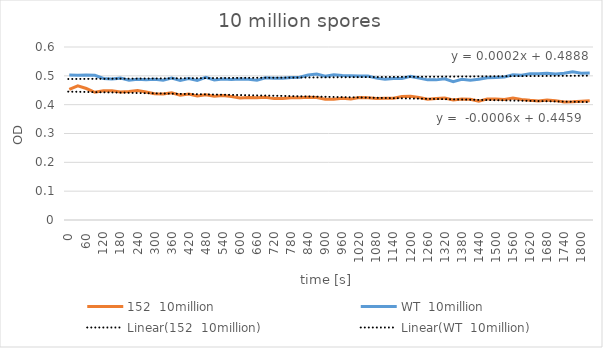
| Category | 152  10million | WT  10million |
|---|---|---|
| 0.0 | 0.453 | 0.503 |
| 30.0 | 0.465 | 0.502 |
| 60.0 | 0.456 | 0.503 |
| 90.0 | 0.443 | 0.502 |
| 120.0 | 0.448 | 0.491 |
| 150.0 | 0.448 | 0.489 |
| 180.0 | 0.444 | 0.492 |
| 210.0 | 0.446 | 0.485 |
| 240.0 | 0.449 | 0.488 |
| 270.0 | 0.444 | 0.486 |
| 300.0 | 0.438 | 0.488 |
| 330.0 | 0.437 | 0.485 |
| 360.0 | 0.441 | 0.492 |
| 390.0 | 0.433 | 0.484 |
| 420.0 | 0.437 | 0.491 |
| 450.0 | 0.43 | 0.484 |
| 480.0 | 0.434 | 0.495 |
| 510.0 | 0.429 | 0.486 |
| 540.0 | 0.432 | 0.489 |
| 570.0 | 0.428 | 0.487 |
| 600.0 | 0.423 | 0.489 |
| 630.0 | 0.425 | 0.488 |
| 660.0 | 0.424 | 0.485 |
| 690.0 | 0.426 | 0.493 |
| 720.0 | 0.421 | 0.492 |
| 750.0 | 0.421 | 0.492 |
| 780.0 | 0.424 | 0.494 |
| 810.0 | 0.424 | 0.495 |
| 840.0 | 0.426 | 0.503 |
| 870.0 | 0.425 | 0.506 |
| 900.0 | 0.419 | 0.499 |
| 930.0 | 0.419 | 0.504 |
| 960.0 | 0.422 | 0.501 |
| 990.0 | 0.42 | 0.5 |
| 1020.0 | 0.425 | 0.499 |
| 1050.0 | 0.424 | 0.499 |
| 1080.0 | 0.421 | 0.492 |
| 1110.0 | 0.422 | 0.488 |
| 1140.0 | 0.422 | 0.491 |
| 1170.0 | 0.428 | 0.491 |
| 1200.0 | 0.429 | 0.498 |
| 1230.0 | 0.425 | 0.492 |
| 1260.0 | 0.419 | 0.486 |
| 1290.0 | 0.421 | 0.486 |
| 1320.0 | 0.423 | 0.49 |
| 1350.0 | 0.416 | 0.48 |
| 1380.0 | 0.42 | 0.488 |
| 1410.0 | 0.419 | 0.485 |
| 1440.0 | 0.412 | 0.488 |
| 1470.0 | 0.42 | 0.493 |
| 1500.0 | 0.42 | 0.494 |
| 1530.0 | 0.418 | 0.496 |
| 1560.0 | 0.423 | 0.504 |
| 1590.0 | 0.418 | 0.502 |
| 1620.0 | 0.415 | 0.507 |
| 1650.0 | 0.413 | 0.507 |
| 1680.0 | 0.416 | 0.509 |
| 1710.0 | 0.414 | 0.506 |
| 1740.0 | 0.409 | 0.509 |
| 1770.0 | 0.41 | 0.514 |
| 1800.0 | 0.412 | 0.509 |
| 1830.0 | 0.414 | 0.51 |